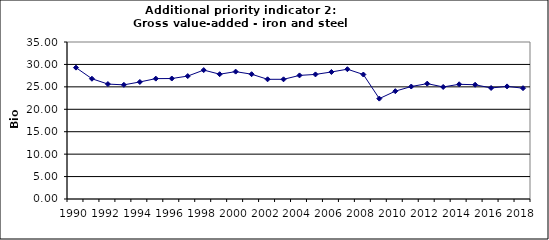
| Category | Gross value-added - iron and steel industry, Bio Euro (EC95) |
|---|---|
| 1990 | 29.284 |
| 1991 | 26.809 |
| 1992 | 25.621 |
| 1993 | 25.447 |
| 1994 | 26.091 |
| 1995 | 26.834 |
| 1996 | 26.858 |
| 1997 | 27.403 |
| 1998 | 28.74 |
| 1999 | 27.824 |
| 2000 | 28.393 |
| 2001 | 27.824 |
| 2002 | 26.685 |
| 2003 | 26.685 |
| 2004 | 27.551 |
| 2005 | 27.774 |
| 2006 | 28.319 |
| 2007 | 28.938 |
| 2008 | 27.749 |
| 2009 | 22.378 |
| 2010 | 24.036 |
| 2011 | 25.076 |
| 2012 | 25.72 |
| 2013 | 24.977 |
| 2014 | 25.571 |
| 2015 | 25.472 |
| 2016 | 24.754 |
| 2017 | 25.101 |
| 2018 | 24.705 |